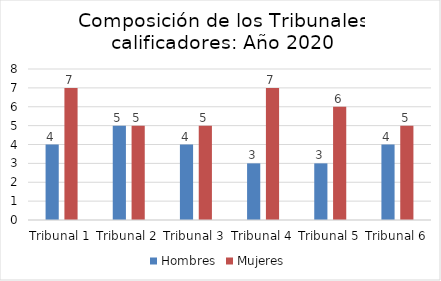
| Category | Hombres | Mujeres |
|---|---|---|
| Tribunal 1 | 4 | 7 |
| Tribunal 2 | 5 | 5 |
| Tribunal 3 | 4 | 5 |
| Tribunal 4 | 3 | 7 |
| Tribunal 5 | 3 | 6 |
| Tribunal 6 | 4 | 5 |